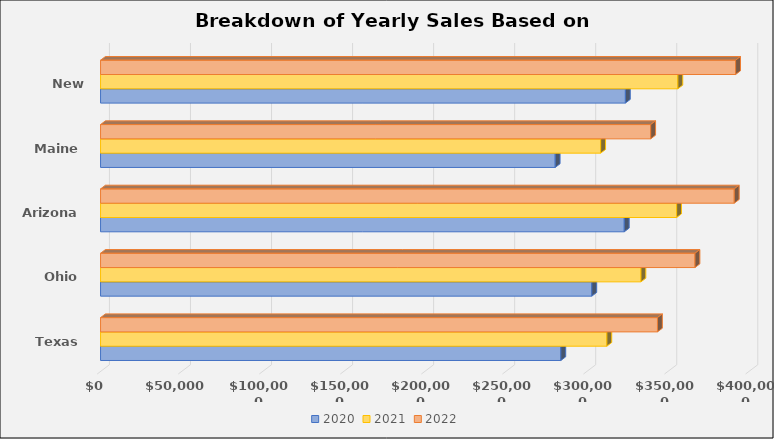
| Category | 2020 | 2021 | 2022 |
|---|---|---|---|
| Texas | 283961 | 312357 | 343592 |
| Ohio | 303076 | 333384 | 366722 |
| Arizona | 323098 | 355407 | 390948 |
| Maine | 280493 | 308543 | 339397 |
| New York | 323793 | 356172 | 391789 |